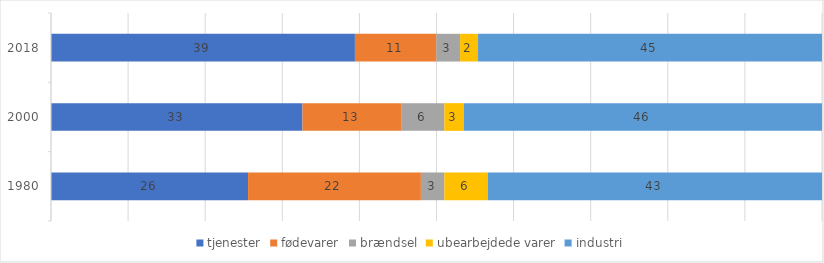
| Category | tjenester | fødevarer | brændsel | ubearbejdede varer | industri |
|---|---|---|---|---|---|
| 1980 | 25.56 | 22.418 | 3.036 | 5.628 | 43.358 |
| 2000 | 32.616 | 12.795 | 5.601 | 2.548 | 46.44 |
| 2018 | 39.419 | 10.574 | 3.068 | 2.327 | 44.612 |